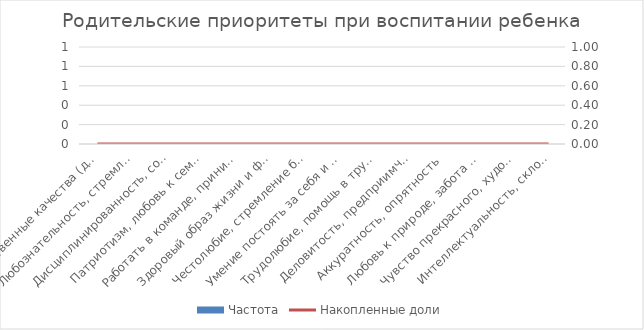
| Category | Частота |
|---|---|
| Нравственные качества (доброта, совесть, честность) | 0 |
| Любознательность, стремление к знаниям и новому | 0 |
| Дисциплинированность, собранность, ответственность | 0 |
| Патриотизм, любовь к семье, своему городу, России | 0 |
| Работать в команде, принимать общие правила и уважать других | 0 |
| Здоровый образ жизни и физическая развитость | 0 |
| Честолюбие, стремление быть лидером, желание успеха | 0 |
| Умение постоять за себя и своих близких | 0 |
| Трудолюбие, помощь в труде и делах по дому  | 0 |
| Деловитость, предприимчивость, чувство хозяина | 0 |
| Аккуратность, опрятность | 0 |
| Любовь к природе, забота о животных и растениях | 0 |
| Чувство прекрасного, художественный вкус  | 0 |
| Интеллектуальность, склонность к размышлениям | 0 |